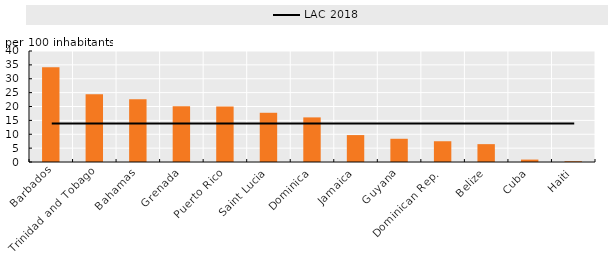
| Category | Barbados |
|---|---|
| Barbados | 34.117 |
| Trinidad and Tobago | 24.401 |
| Bahamas | 22.577 |
| Grenada | 20.054 |
| Puerto Rico | 20.036 |
| Saint Lucia | 17.739 |
| Dominica | 16.075 |
| Jamaica | 9.703 |
| Guyana | 8.37 |
| Dominican Rep.  | 7.479 |
| Belize | 6.437 |
| Cuba | 0.872 |
| Haiti | 0.28 |